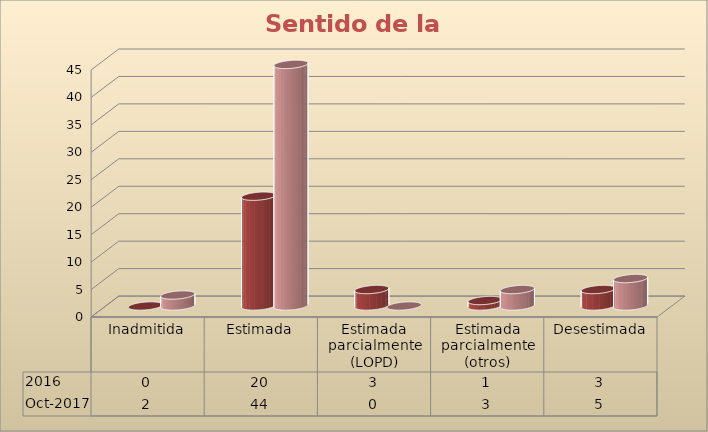
| Category | 2016 | oct-2017 |
|---|---|---|
| Inadmitida | 0 | 2 |
| Estimada | 20 | 44 |
| Estimada parcialmente (LOPD) | 3 | 0 |
| Estimada parcialmente (otros) | 1 | 3 |
| Desestimada | 3 | 5 |